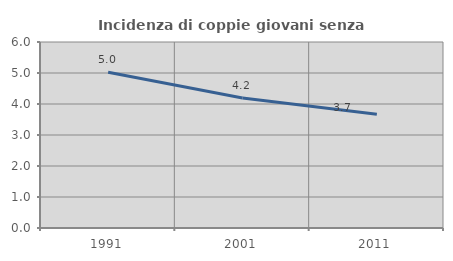
| Category | Incidenza di coppie giovani senza figli |
|---|---|
| 1991.0 | 5.025 |
| 2001.0 | 4.193 |
| 2011.0 | 3.671 |